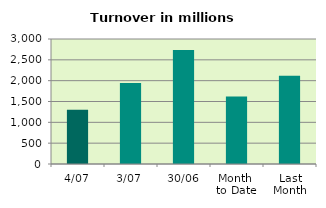
| Category | Series 0 |
|---|---|
| 4/07 | 1302.321 |
| 3/07 | 1941.15 |
| 30/06 | 2733.742 |
| Month 
to Date | 1621.735 |
| Last
Month | 2115.436 |